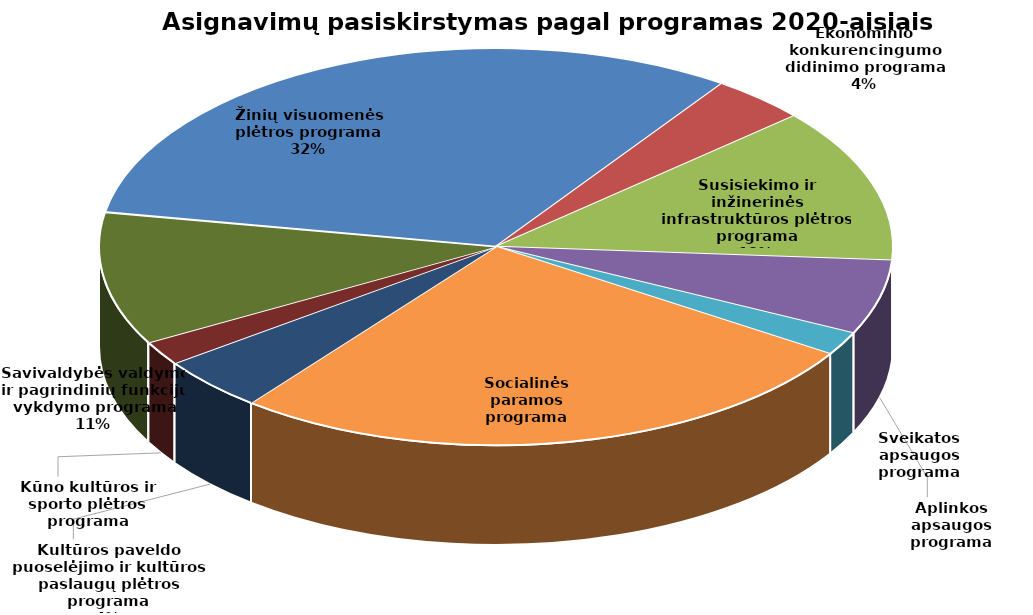
| Category | Series 0 |
|---|---|
| Žinių visuomenės plėtros programa | 29884.591 |
| Ekonominio konkurencingumo didinimo programa | 3660.4 |
| Susisiekimo ir inžinerinės infrastruktūros plėtros programa | 11776.1 |
| Aplinkos apsaugos programa | 5691.2 |
| Sveikatos apsaugos programa | 1785.3 |
| Socialinės paramos programa | 24851.41 |
| Kultūros paveldo puoselėjimo ir kultūros paslaugų plėtros programa | 4154.38 |
| Kūno kultūros ir sporto plėtros programa | 1837.9 |
| Savivaldybės valdymo ir pagrindinių funkcijų vykdymo programa | 10129.892 |